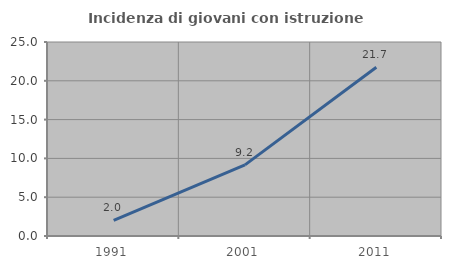
| Category | Incidenza di giovani con istruzione universitaria |
|---|---|
| 1991.0 | 2.02 |
| 2001.0 | 9.16 |
| 2011.0 | 21.739 |